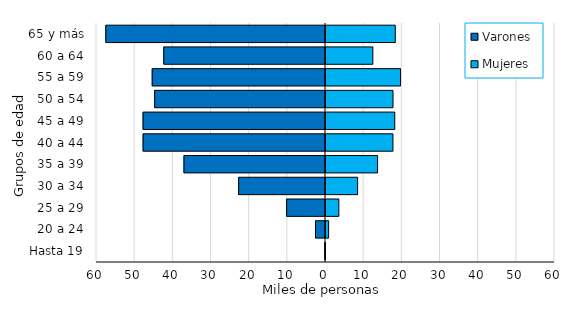
| Category | Varones | Mujeres |
|---|---|---|
| Hasta 19 | -139 | 75 |
| 20 a 24 | -2623 | 949 |
| 25 a 29 | -10189 | 3630 |
| 30 a 34 | -22764 | 8540 |
| 35 a 39 | -37085 | 13780 |
| 40 a 44 | -47794 | 17802 |
| 45 a 49 | -47803 | 18277 |
| 50 a 54 | -44767 | 17818 |
| 55 a 59 | -45403 | 19786 |
| 60 a 64 | -42382 | 12541 |
| 65 y más | -57556 | 18414 |